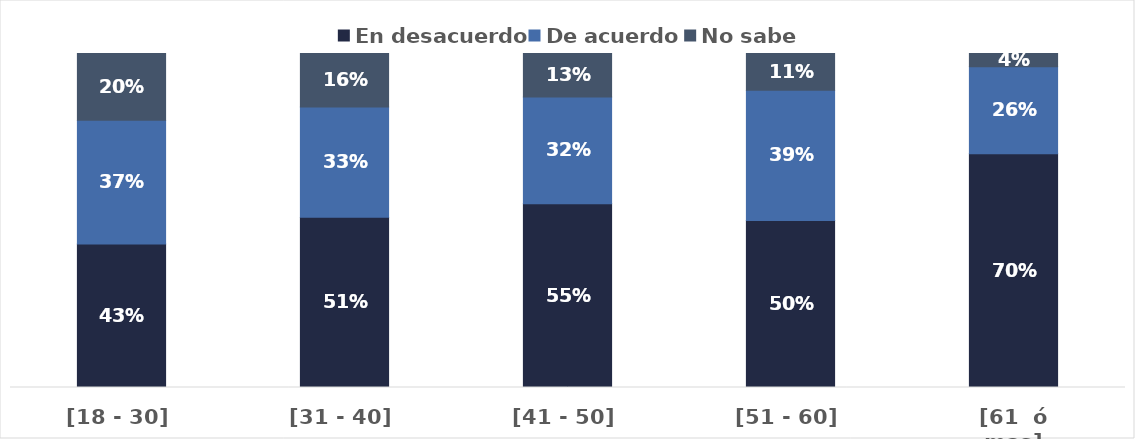
| Category | En desacuerdo | De acuerdo | No sabe |
|---|---|---|---|
| [18 - 30] | 0.43 | 0.37 | 0.2 |
| [31 - 40] | 0.51 | 0.33 | 0.16 |
| [41 - 50] | 0.55 | 0.32 | 0.13 |
| [51 - 60] | 0.5 | 0.39 | 0.11 |
| [61  ó mas] | 0.7 | 0.26 | 0.04 |